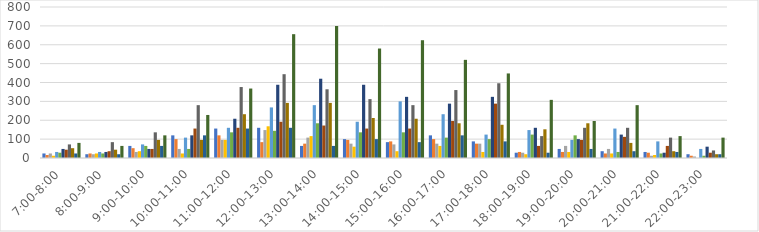
| Category | Series 0 | Series 1 | Series 2 | Series 3 | Series 4 | Series 5 | Series 6 | Series 7 | Series 8 | Series 9 | Series 10 | Series 11 |
|---|---|---|---|---|---|---|---|---|---|---|---|---|
| 7:00-8:00 | 24 | 16 | 24 | 12 | 32 | 28 | 48 | 44 | 72 | 52 | 24 | 80 |
| 8:00-9:00 | 20 | 24 | 20 | 24 | 32 | 24 | 32 | 36 | 84 | 44 | 20 | 64 |
| 9:00-10:00 | 64 | 52 | 32 | 36 | 72 | 64 | 48 | 48 | 136 | 96 | 64 | 120 |
| 10:00-11:00 | 120 | 100 | 48 | 24 | 108 | 48 | 120 | 156 | 280 | 96 | 120 | 228 |
| 11:00-12:00 | 156 | 120 | 96 | 96 | 160 | 136 | 208 | 160 | 376 | 232 | 156 | 368 |
| 12:00-13:00 | 160 | 84 | 148 | 168 | 268 | 144 | 388 | 192 | 444 | 292 | 160 | 656 |
| 13:00-14:00 | 64 | 76 | 108 | 116 | 280 | 184 | 420 | 172 | 364 | 292 | 64 | 700 |
| 14:00-15:00 | 100 | 96 | 76 | 60 | 192 | 136 | 388 | 156 | 312 | 212 | 100 | 580 |
| 15:00-16:00 | 84 | 88 | 72 | 36 | 300 | 136 | 324 | 156 | 280 | 208 | 84 | 624 |
| 16:00-17:00 | 120 | 100 | 76 | 64 | 232 | 108 | 288 | 196 | 360 | 184 | 120 | 520 |
| 17:00-18:00 | 88 | 76 | 76 | 32 | 124 | 100 | 324 | 288 | 396 | 176 | 88 | 448 |
| 18:00-19:00 | 28 | 32 | 28 | 20 | 148 | 124 | 160 | 64 | 116 | 152 | 28 | 308 |
| 19:00-20:00 | 48 | 32 | 64 | 32 | 96 | 120 | 100 | 96 | 160 | 184 | 48 | 196 |
| 20:00-21:00 | 36 | 24 | 48 | 24 | 156 | 32 | 124 | 112 | 160 | 80 | 36 | 280 |
| 21:00-22:00 | 32 | 28 | 12 | 16 | 88 | 24 | 28 | 64 | 108 | 36 | 32 | 116 |
| 22:00-23:00 | 20 | 12 | 8 | 0 | 48 | 12 | 60 | 28 | 40 | 20 | 20 | 108 |